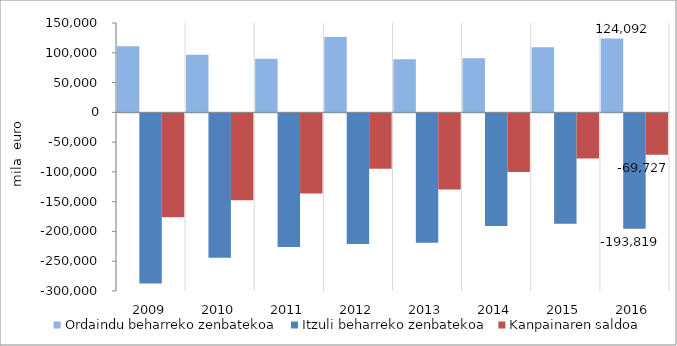
| Category | Ordaindu beharreko zenbatekoa | Itzuli beharreko zenbatekoa | Kanpainaren saldoa |
|---|---|---|---|
| 2009.0 | 111037.303 | -285706.971 | -174669.668 |
| 2010.0 | 96576.254 | -242527.91 | -145951.656 |
| 2011.0 | 90014.588 | -224438.011 | -134423.423 |
| 2012.0 | 126538.987 | -219516.481 | -92977.494 |
| 2013.0 | 89274.189 | -217318.717 | -128044.528 |
| 2014.0 | 90756.111 | -189377.902 | -98621.791 |
| 2015.0 | 109397.392 | -185305.11 | -75907.718 |
| 2016.0 | 124091.908 | -193818.822 | -69726.914 |